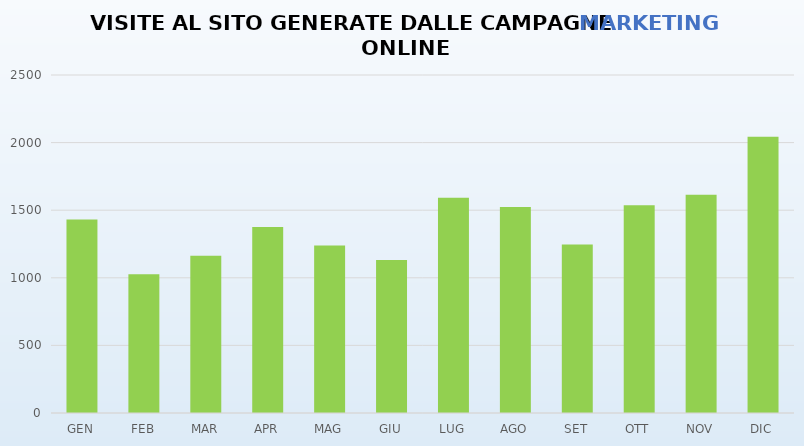
| Category | Series 0 |
|---|---|
| GEN | 1432 |
| FEB | 1027 |
| MAR | 1163 |
| APR | 1375 |
| MAG | 1239 |
| GIU | 1132 |
| LUG | 1593 |
| AGO | 1523 |
| SET | 1246 |
| OTT | 1537 |
| NOV | 1614 |
| DIC | 2043 |